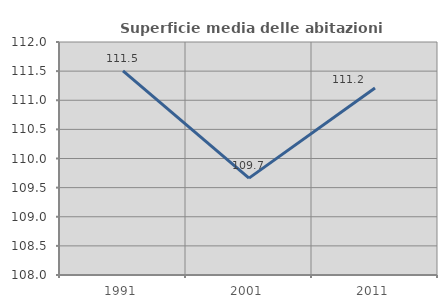
| Category | Superficie media delle abitazioni occupate |
|---|---|
| 1991.0 | 111.504 |
| 2001.0 | 109.663 |
| 2011.0 | 111.211 |